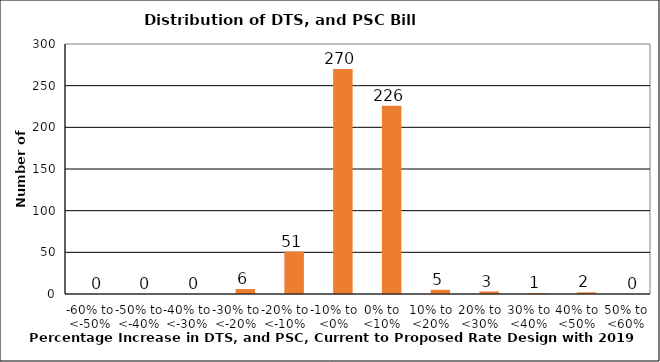
| Category | Series 0 | Series 1 |
|---|---|---|
| -60% to <-50% |  | 0 |
| -50% to <-40% |  | 0 |
| -40% to <-30% |  | 0 |
| -30% to <-20% |  | 6 |
| -20% to <-10% |  | 51 |
| -10% to <0% |  | 270 |
| 0% to <10% |  | 226 |
| 10% to <20% |  | 5 |
| 20% to <30% |  | 3 |
| 30% to <40% |  | 1 |
| 40% to <50% |  | 2 |
| 50% to <60% |  | 0 |